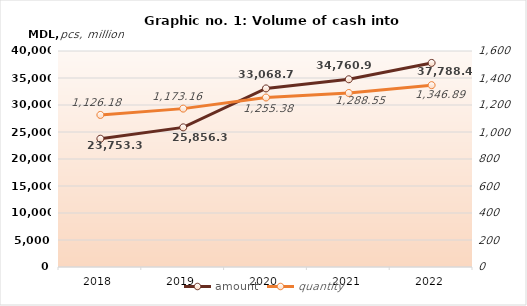
| Category | amount |
|---|---|
| 2018 | 23753.32 |
| 2019 | 25856.34 |
| 2020 | 33068.73 |
| 2021 | 34760.96 |
| 2022 | 37788.43 |